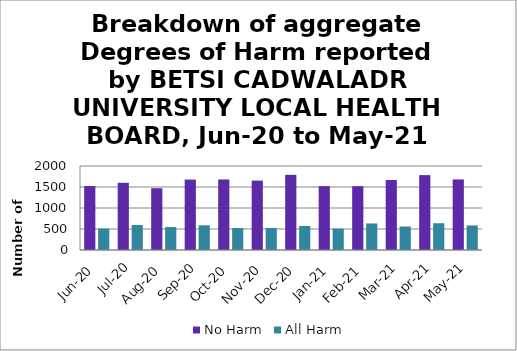
| Category | No Harm | All Harm |
|---|---|---|
| Jun-20 | 1523 | 511 |
| Jul-20 | 1600 | 596 |
| Aug-20 | 1471 | 546 |
| Sep-20 | 1677 | 588 |
| Oct-20 | 1679 | 523 |
| Nov-20 | 1652 | 526 |
| Dec-20 | 1789 | 571 |
| Jan-21 | 1521 | 509 |
| Feb-21 | 1520 | 632 |
| Mar-21 | 1667 | 559 |
| Apr-21 | 1783 | 637 |
| May-21 | 1680 | 585 |